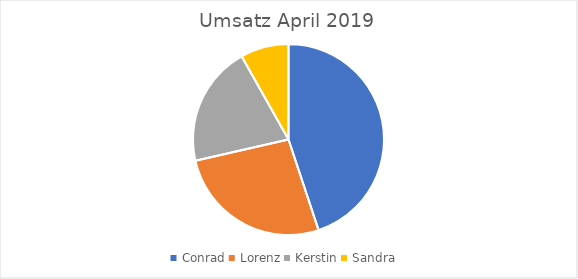
| Category | Umsatz April 2019 |
|---|---|
| Conrad | 1100 |
| Lorenz | 650 |
| Kerstin | 500 |
| Sandra | 200 |